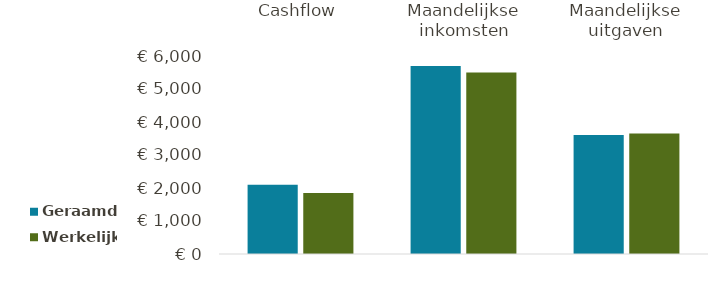
| Category | Geraamd | Werkelijk |
|---|---|---|
| Cashflow | 2097 | 1845 |
| Maandelijkse inkomsten | 5700 | 5500 |
| Maandelijkse uitgaven | 3603 | 3655 |